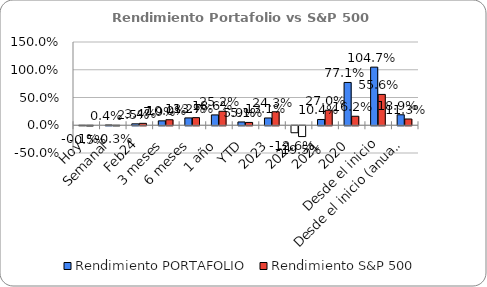
| Category | Rendimiento PORTAFOLIO | Rendimiento S&P 500 |
|---|---|---|
| Hoy | -0.001 | -0.005 |
| Semanal | 0.004 | -0.003 |
| Feb24 | 0.025 | 0.034 |
| 3 meses | 0.079 | 0.1 |
| 6 meses | 0.132 | 0.137 |
| 1 año | 0.186 | 0.252 |
| YTD | 0.059 | 0.051 |
| 2023 | 0.131 | 0.243 |
| 2022 | -0.126 | -0.195 |
| 2021 | 0.104 | 0.27 |
| 2020 | 0.771 | 0.162 |
| Desde el inicio | 1.047 | 0.556 |
| Desde el inicio (anual) | 0.189 | 0.113 |